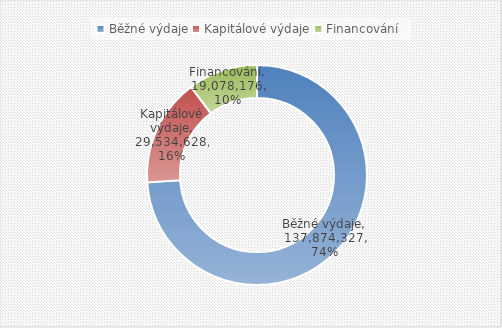
| Category | Series 0 |
|---|---|
| Běžné výdaje | 137874327.185 |
| Kapitálové výdaje | 29534627.68 |
| Financování | 19078176.305 |